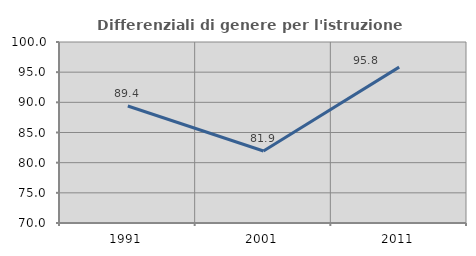
| Category | Differenziali di genere per l'istruzione superiore |
|---|---|
| 1991.0 | 89.385 |
| 2001.0 | 81.927 |
| 2011.0 | 95.84 |